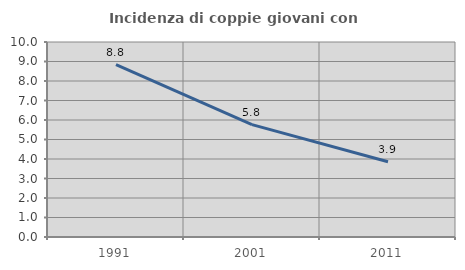
| Category | Incidenza di coppie giovani con figli |
|---|---|
| 1991.0 | 8.834 |
| 2001.0 | 5.761 |
| 2011.0 | 3.862 |